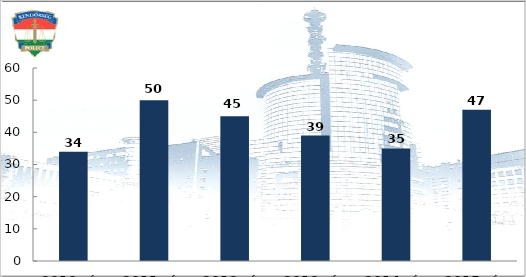
| Category | Könnyű sérüléses közúti közlekedési balesetek |
|---|---|
| 2010. év | 34 |
| 2011. év | 50 |
| 2012. év | 45 |
| 2013. év | 39 |
| 2014. év | 35 |
| 2015. év | 47 |